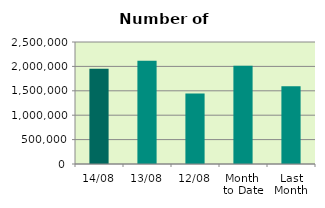
| Category | Series 0 |
|---|---|
| 14/08 | 1949478 |
| 13/08 | 2113594 |
| 12/08 | 1444362 |
| Month 
to Date | 2011240.6 |
| Last
Month | 1591495.826 |